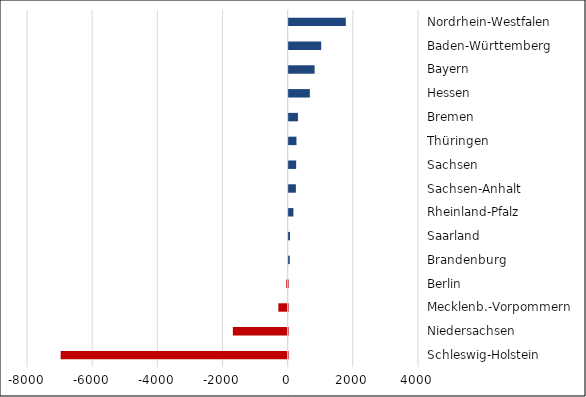
| Category | Series 0 |
|---|---|
| Schleswig-Holstein | -6967 |
| Niedersachsen | -1682 |
| Mecklenb.-Vorpommern | -286 |
| Berlin | -42 |
| Brandenburg | 34 |
| Saarland | 42 |
| Rheinland-Pfalz | 145 |
| Sachsen-Anhalt | 221 |
| Sachsen | 230 |
| Thüringen | 239 |
| Bremen | 285 |
| Hessen | 650 |
| Bayern | 796 |
| Baden-Württemberg | 998 |
| Nordrhein-Westfalen | 1754 |